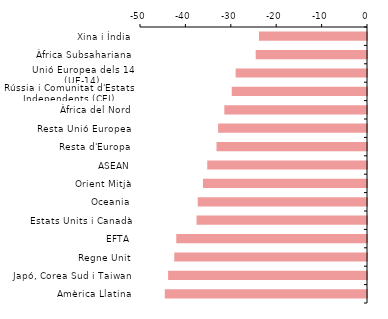
| Category | Series 0 |
|---|---|
| Xina i Índia | -23.795 |
| Àfrica Subsahariana | -24.517 |
| Unió Europea dels 14 (UE-14) | -28.934 |
| Rússia i Comunitat d'Estats Independents (CEI) | -29.788 |
| Àfrica del Nord | -31.427 |
| Resta Unió Europea | -32.799 |
| Resta d'Europa | -33.148 |
| ASEAN | -35.19 |
| Orient Mitjà | -36.132 |
| Oceania | -37.286 |
| Estats Units i Canadà | -37.545 |
| EFTA | -42.013 |
| Regne Unit | -42.459 |
| Japó, Corea Sud i Taiwan | -43.812 |
| Amèrica Llatina | -44.539 |